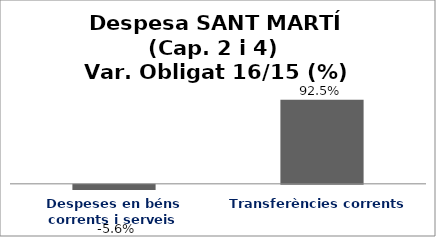
| Category | Series 0 |
|---|---|
| Despeses en béns corrents i serveis | -0.056 |
| Transferències corrents | 0.925 |